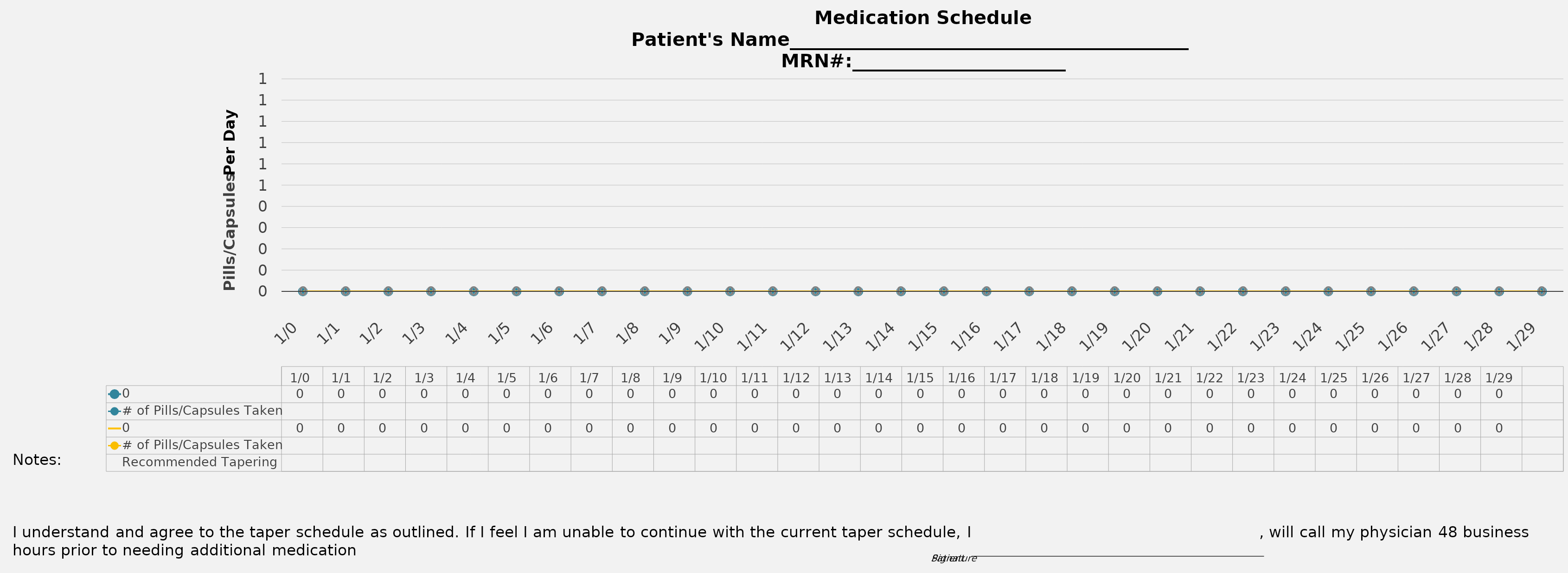
| Category | 0 | # of Pills/Capsules Taken | Recommended Tapering  |
|---|---|---|---|
| 0.0 | 0 |  |  |
| 1900-01-01 | 0 |  |  |
| 1900-01-02 | 0 |  |  |
| 1900-01-03 | 0 |  |  |
| 1900-01-04 | 0 |  |  |
| 1900-01-05 | 0 |  |  |
| 1900-01-06 | 0 |  |  |
| 1900-01-07 | 0 |  |  |
| 1900-01-08 | 0 |  |  |
| 1900-01-09 | 0 |  |  |
| 1900-01-10 | 0 |  |  |
| 1900-01-11 | 0 |  |  |
| 1900-01-12 | 0 |  |  |
| 1900-01-13 | 0 |  |  |
| 1900-01-14 | 0 |  |  |
| 1900-01-15 | 0 |  |  |
| 1900-01-16 | 0 |  |  |
| 1900-01-17 | 0 |  |  |
| 1900-01-18 | 0 |  |  |
| 1900-01-19 | 0 |  |  |
| 1900-01-20 | 0 |  |  |
| 1900-01-21 | 0 |  |  |
| 1900-01-22 | 0 |  |  |
| 1900-01-23 | 0 |  |  |
| 1900-01-24 | 0 |  |  |
| 1900-01-25 | 0 |  |  |
| 1900-01-26 | 0 |  |  |
| 1900-01-27 | 0 |  |  |
| 1900-01-28 | 0 |  |  |
| 1900-01-29 | 0 |  |  |